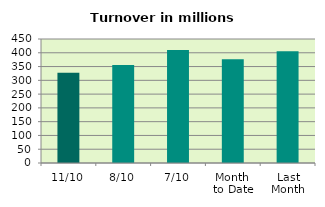
| Category | Series 0 |
|---|---|
| 11/10 | 327.249 |
| 8/10 | 355.815 |
| 7/10 | 409.861 |
| Month 
to Date | 376.203 |
| Last
Month | 405.806 |